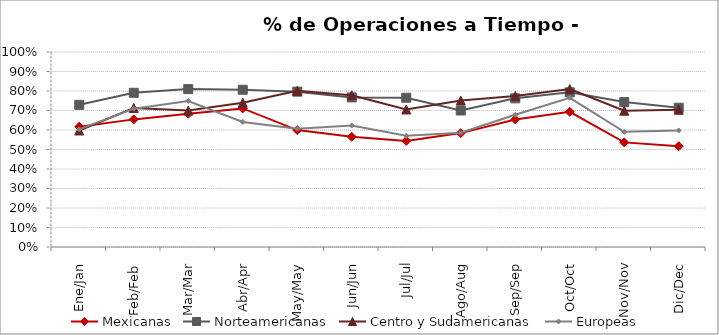
| Category | Mexicanas | Norteamericanas | Centro y Sudamericanas | Europeas |
|---|---|---|---|---|
| Ene/Jan | 0.617 | 0.729 | 0.598 | 0.603 |
| Feb/Feb | 0.654 | 0.791 | 0.713 | 0.709 |
| Mar/Mar | 0.684 | 0.81 | 0.7 | 0.749 |
| Abr/Apr | 0.711 | 0.806 | 0.74 | 0.641 |
| May/May | 0.6 | 0.797 | 0.801 | 0.607 |
| Jun/Jun | 0.565 | 0.767 | 0.778 | 0.623 |
| Jul/Jul | 0.544 | 0.765 | 0.705 | 0.57 |
| Ago/Aug | 0.584 | 0.7 | 0.752 | 0.586 |
| Sep/Sep | 0.654 | 0.762 | 0.775 | 0.678 |
| Oct/Oct | 0.693 | 0.793 | 0.81 | 0.765 |
| Nov/Nov | 0.537 | 0.743 | 0.699 | 0.591 |
| Dic/Dec | 0.517 | 0.714 | 0.704 | 0.598 |